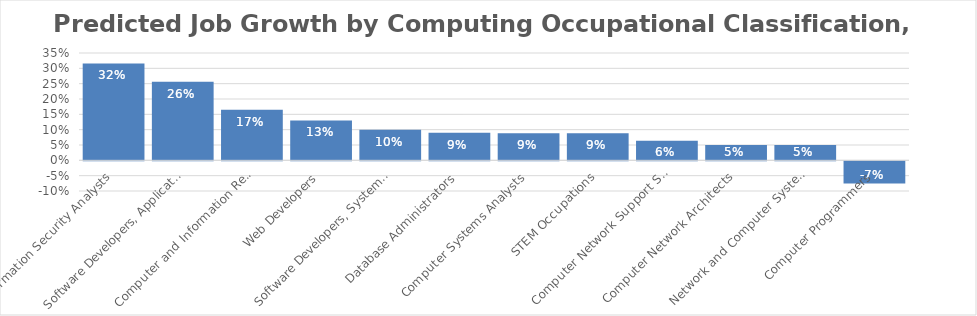
| Category | Predicted Change |
|---|---|
| Information Security Analysts | 0.316 |
| Software Developers, Applications | 0.256 |
| Computer and Information Research Scientists | 0.165 |
| Web Developers | 0.13 |
| Software Developers, Systems Software | 0.1 |
| Database Administrators | 0.09 |
| Computer Systems Analysts | 0.088 |
| STEM Occupations | 0.088 |
| Computer Network Support Specialists | 0.064 |
| Computer Network Architects | 0.05 |
| Network and Computer Systems Administrators | 0.05 |
| Computer Programmers | -0.072 |